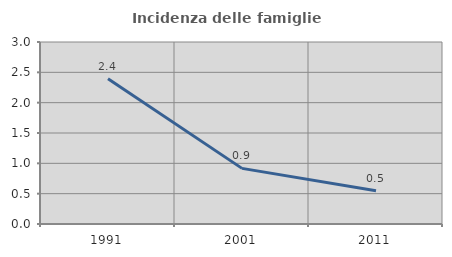
| Category | Incidenza delle famiglie numerose |
|---|---|
| 1991.0 | 2.395 |
| 2001.0 | 0.917 |
| 2011.0 | 0.547 |